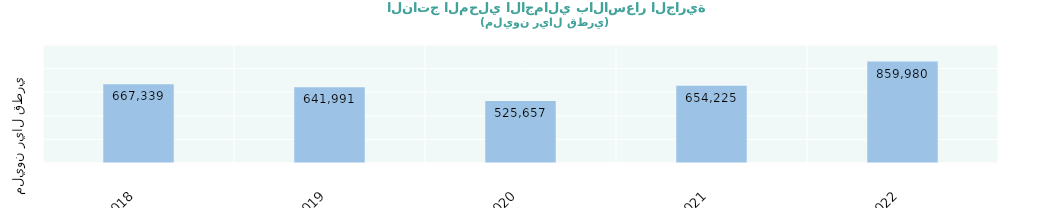
| Category | Series 0 |
|---|---|
| 2018.0 | 667339.232 |
| 2019.0 | 641991.414 |
| 2020.0 | 525657.363 |
| 2021.0 | 654224.515 |
| 2022.0 | 859980.222 |